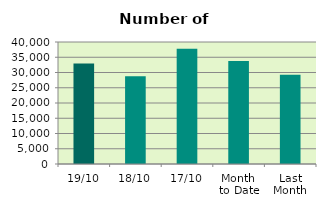
| Category | Series 0 |
|---|---|
| 19/10 | 32924 |
| 18/10 | 28764 |
| 17/10 | 37802 |
| Month 
to Date | 33771.6 |
| Last
Month | 29250.6 |